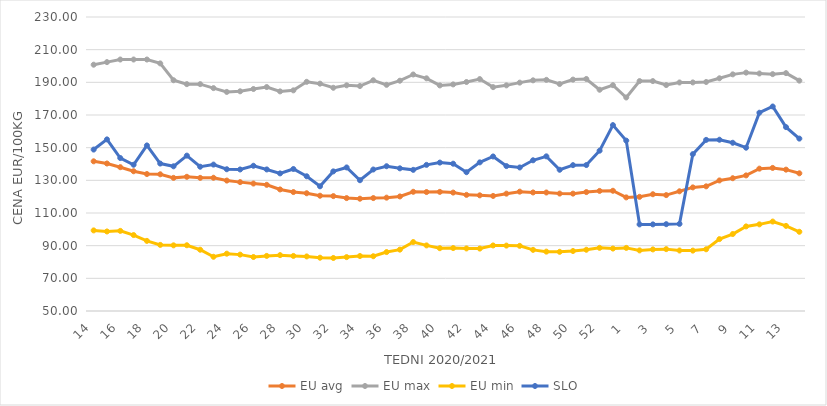
| Category | EU avg | EU max | EU min | SLO |
|---|---|---|---|---|
| 14.0 | 141.645 | 200.79 | 99.347 | 148.84 |
| 15.0 | 140.306 | 202.38 | 98.696 | 155.07 |
| 16.0 | 138.046 | 203.97 | 99.065 | 143.65 |
| 17.0 | 135.556 | 203.97 | 96.499 | 139.55 |
| 18.0 | 133.857 | 203.97 | 92.931 | 151.36 |
| 19.0 | 133.702 | 201.59 | 90.48 | 140.27 |
| 20.0 | 131.51 | 191.27 | 90.199 | 138.59 |
| 21.0 | 132.157 | 188.89 | 90.255 | 145.12 |
| 22.0 | 131.509 | 188.89 | 87.513 | 138.33 |
| 23.0 | 131.578 | 186.47 | 83.199 | 139.64 |
| 24.0 | 129.861 | 184.13 | 85.09 | 136.79 |
| 25.0 | 128.899 | 184.51 | 84.52 | 136.65 |
| 26.0 | 128.034 | 185.91 | 83.06 | 138.92 |
| 27.0 | 127.242 | 187.11 | 83.73 | 136.67 |
| 28.0 | 124.426 | 184.46 | 84.2 | 134.25 |
| 29.0 | 122.822 | 185.09 | 83.72 | 136.94 |
| 30.0 | 122.086 | 190.31 | 83.4 | 132.48 |
| 31.0 | 120.581 | 189.19 | 82.63 | 126.34 |
| 32.0 | 120.341 | 186.67 | 82.46 | 135.48 |
| 33.0 | 119.127 | 188.18 | 82.99 | 137.89 |
| 34.0 | 118.75 | 187.74 | 83.66 | 130.07 |
| 35.0 | 119.136 | 191.25 | 83.53 | 136.63 |
| 36.0 | 119.398 | 188.47 | 86.09 | 138.64 |
| 37.0 | 120.135 | 190.99 | 87.57 | 137.35 |
| 38.0 | 122.982 | 194.8 | 92.21 | 136.42 |
| 39.0 | 122.832 | 192.45 | 90.16 | 139.46 |
| 40.0 | 122.936 | 188.11 | 88.45 | 140.87 |
| 41.0 | 122.507 | 188.73 | 88.54 | 140.18 |
| 42.0 | 121.098 | 190.2 | 88.3 | 134.98 |
| 43.0 | 120.822 | 191.99 | 88.22 | 141 |
| 44.0 | 120.448 | 187.06 | 90.13 | 144.61 |
| 45.0 | 121.843 | 188.15 | 90.04 | 138.73 |
| 46.0 | 123.07 | 189.82 | 89.89 | 137.88 |
| 47.0 | 122.58 | 191.22 | 87.43 | 142.27 |
| 48.0 | 122.553 | 191.52 | 86.35 | 144.69 |
| 49.0 | 121.893 | 188.97 | 86.24 | 136.47 |
| 50.0 | 121.851 | 191.67 | 86.72 | 139.29 |
| 51.0 | 122.8 | 192.06 | 87.5 | 139.35 |
| 52.0 | 123.52 | 185.468 | 88.67 | 148.16 |
| 53.0 | 123.611 | 188.25 | 88.23 | 163.81 |
| 1.0 | 119.553 | 180.72 | 88.64 | 154.31 |
| 2.0 | 119.893 | 190.77 | 87.1 | 103.02 |
| 3.0 | 121.489 | 190.76 | 87.7 | 103.03 |
| 4.0 | 120.954 | 188.33 | 87.88 | 103.15 |
| 5.0 | 123.293 | 189.91 | 87.04 | 103.34 |
| 6.0 | 125.679 | 189.94 | 86.97 | 146.03 |
| 7.0 | 126.326 | 190.21 | 87.79 | 154.77 |
| 8.0 | 129.933 | 192.48 | 94.02 | 154.86 |
| 9.0 | 131.295 | 194.884 | 97.12 | 153 |
| 10.0 | 133.026 | 195.94 | 101.79 | 149.98 |
| 11.0 | 137.152 | 195.419 | 103.05 | 171.4 |
| 12.0 | 137.599 | 195.013 | 104.76 | 175.2 |
| 13.0 | 136.546 | 195.64 | 102.11 | 162.57 |
| 14.0 | 134.308 | 191.034 | 98.5 | 155.55 |